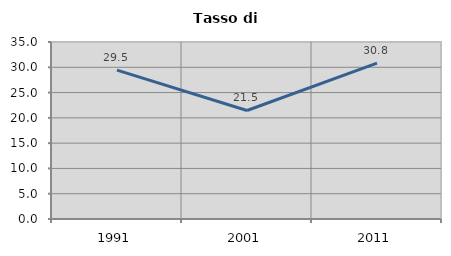
| Category | Tasso di disoccupazione   |
|---|---|
| 1991.0 | 29.45 |
| 2001.0 | 21.459 |
| 2011.0 | 30.823 |